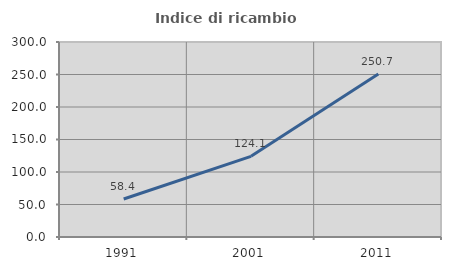
| Category | Indice di ricambio occupazionale  |
|---|---|
| 1991.0 | 58.397 |
| 2001.0 | 124.057 |
| 2011.0 | 250.694 |